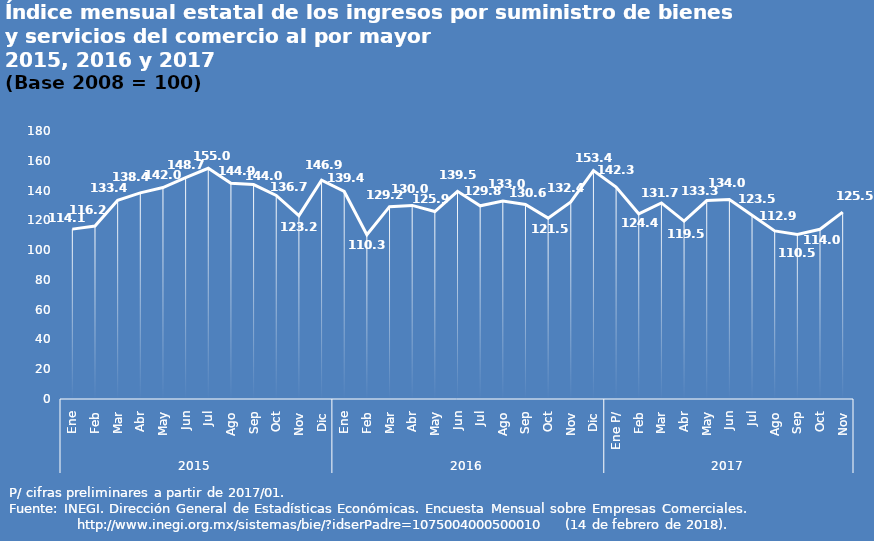
| Category | Series 0 |
|---|---|
| 0 | 114.087 |
| 1 | 116.204 |
| 2 | 133.423 |
| 3 | 138.433 |
| 4 | 142.047 |
| 5 | 148.713 |
| 6 | 154.959 |
| 7 | 144.861 |
| 8 | 144.03 |
| 9 | 136.693 |
| 10 | 123.185 |
| 11 | 146.906 |
| 12 | 139.365 |
| 13 | 110.291 |
| 14 | 129.189 |
| 15 | 130.032 |
| 16 | 125.931 |
| 17 | 139.49 |
| 18 | 129.765 |
| 19 | 133.005 |
| 20 | 130.622 |
| 21 | 121.462 |
| 22 | 132.417 |
| 23 | 153.443 |
| 24 | 142.349 |
| 25 | 124.401 |
| 26 | 131.7 |
| 27 | 119.507 |
| 28 | 133.268 |
| 29 | 133.962 |
| 30 | 123.473 |
| 31 | 112.891 |
| 32 | 110.513 |
| 33 | 114.019 |
| 34 | 125.524 |